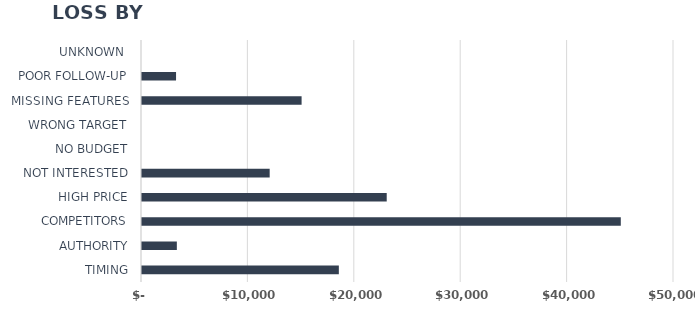
| Category | Series 1 |
|---|---|
| TIMING | 18500 |
| AUTHORITY | 3275 |
| COMPETITORS | 45000 |
| HIGH PRICE | 23000 |
| NOT INTERESTED | 12000 |
| NO BUDGET | 0 |
| WRONG TARGET | 0 |
| MISSING FEATURES | 15000 |
| POOR FOLLOW-UP | 3200 |
| UNKNOWN  | 0 |